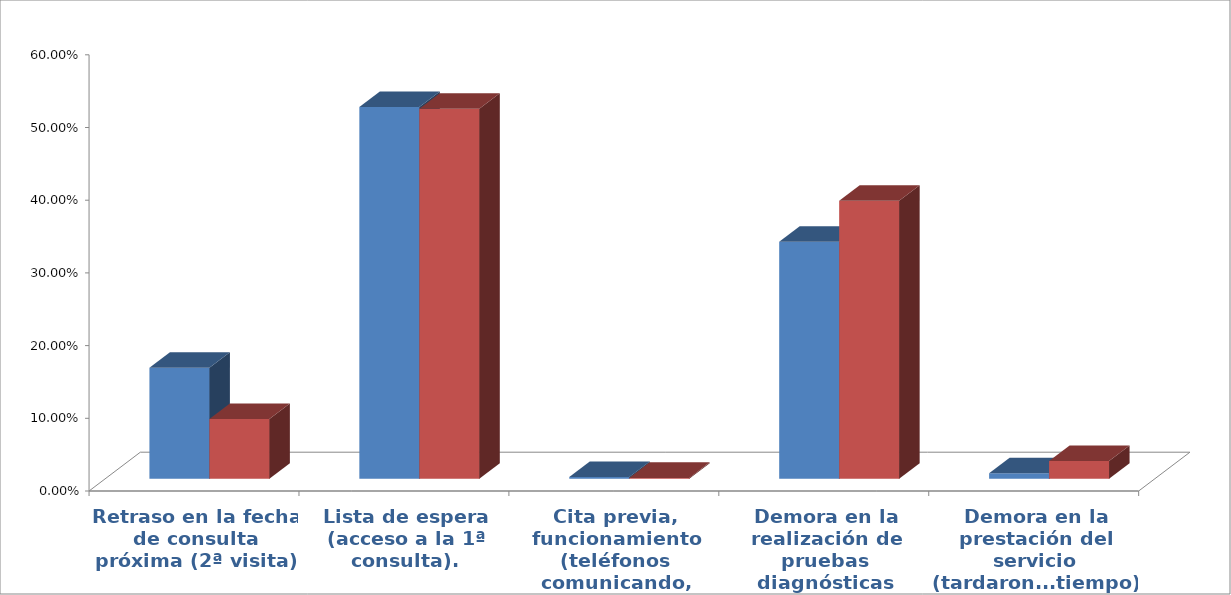
| Category | Series 0 | Series 1 |
|---|---|---|
| Retraso en la fecha de consulta próxima (2ª visita) | 0.153 | 0.082 |
| Lista de espera (acceso a la 1ª consulta). | 0.511 | 0.509 |
| Cita previa, funcionamiento (teléfonos comunicando, etc...) | 0.003 | 0.001 |
| Demora en la realización de pruebas diagnósticas | 0.326 | 0.382 |
| Demora en la prestación del servicio (tardaron...tiempo) | 0.008 | 0.024 |